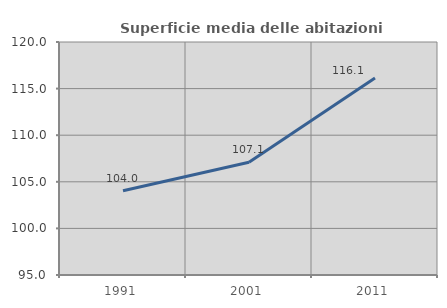
| Category | Superficie media delle abitazioni occupate |
|---|---|
| 1991.0 | 104.032 |
| 2001.0 | 107.092 |
| 2011.0 | 116.127 |